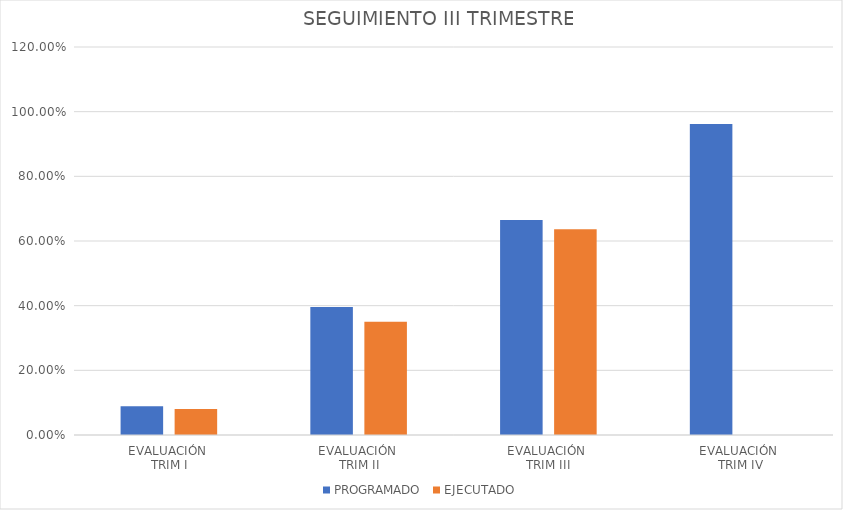
| Category | PROGRAMADO | EJECUTADO |
|---|---|---|
| EVALUACIÓN 
TRIM I | 0.089 | 0.08 |
| EVALUACIÓN 
TRIM II | 0.396 | 0.35 |
| EVALUACIÓN 
TRIM III | 0.665 | 0.636 |
| EVALUACIÓN
 TRIM IV | 0.962 | 0 |